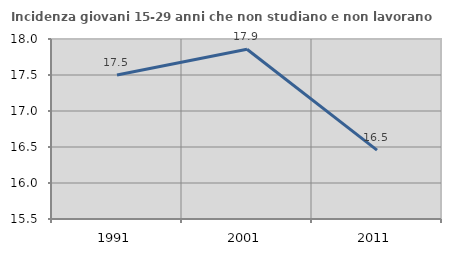
| Category | Incidenza giovani 15-29 anni che non studiano e non lavorano  |
|---|---|
| 1991.0 | 17.5 |
| 2001.0 | 17.857 |
| 2011.0 | 16.456 |